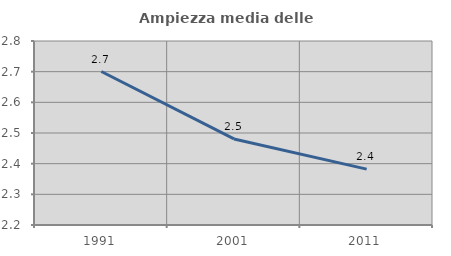
| Category | Ampiezza media delle famiglie |
|---|---|
| 1991.0 | 2.7 |
| 2001.0 | 2.481 |
| 2011.0 | 2.382 |